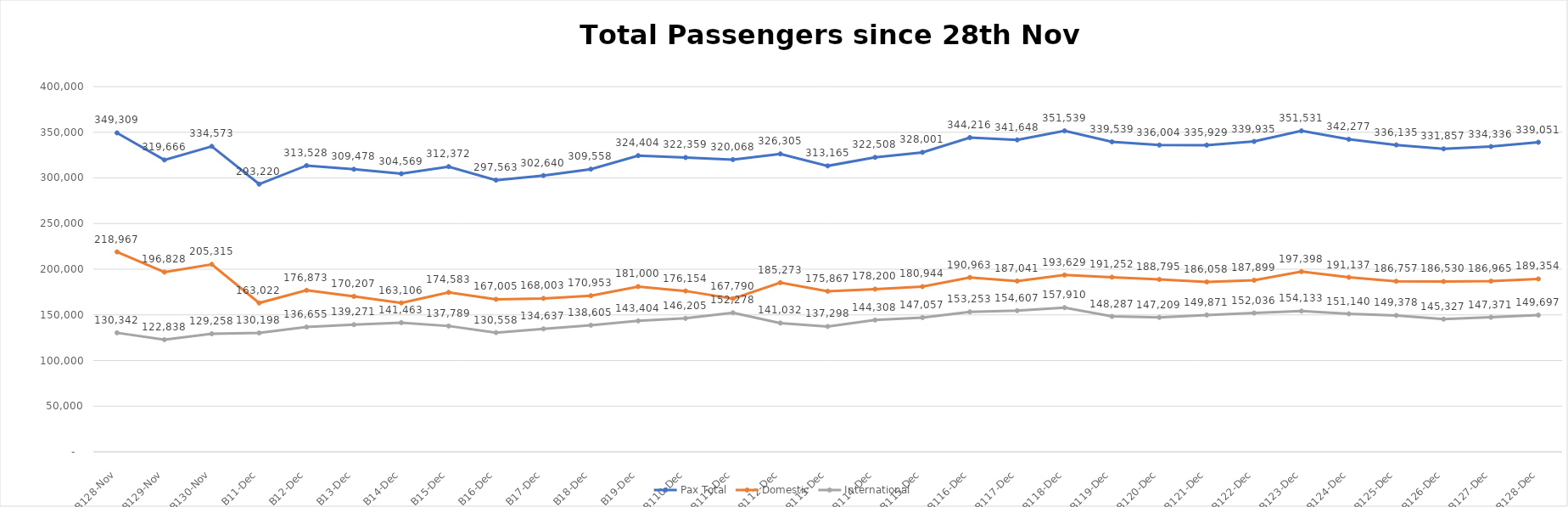
| Category | Pax Total |  Domestic  |  International  |
|---|---|---|---|
| 2022-11-28 | 349309 | 218967 | 130342 |
| 2022-11-29 | 319666 | 196828 | 122838 |
| 2022-11-30 | 334573 | 205315 | 129258 |
| 2022-12-01 | 293220 | 163022 | 130198 |
| 2022-12-02 | 313528 | 176873 | 136655 |
| 2022-12-03 | 309478 | 170207 | 139271 |
| 2022-12-04 | 304569 | 163106 | 141463 |
| 2022-12-05 | 312372 | 174583 | 137789 |
| 2022-12-06 | 297563 | 167005 | 130558 |
| 2022-12-07 | 302640 | 168003 | 134637 |
| 2022-12-08 | 309558 | 170953 | 138605 |
| 2022-12-09 | 324404 | 181000 | 143404 |
| 2022-12-10 | 322359 | 176154 | 146205 |
| 2022-12-11 | 320068 | 167790 | 152278 |
| 2022-12-12 | 326305 | 185273 | 141032 |
| 2022-12-13 | 313165 | 175867 | 137298 |
| 2022-12-14 | 322508 | 178200 | 144308 |
| 2022-12-15 | 328001 | 180944 | 147057 |
| 2022-12-16 | 344216 | 190963 | 153253 |
| 2022-12-17 | 341648 | 187041 | 154607 |
| 2022-12-18 | 351539 | 193629 | 157910 |
| 2022-12-19 | 339539 | 191252 | 148287 |
| 2022-12-20 | 336004 | 188795 | 147209 |
| 2022-12-21 | 335929 | 186058 | 149871 |
| 2022-12-22 | 339935 | 187899 | 152036 |
| 2022-12-23 | 351531 | 197398 | 154133 |
| 2022-12-24 | 342277 | 191137 | 151140 |
| 2022-12-25 | 336135 | 186757 | 149378 |
| 2022-12-26 | 331857 | 186530 | 145327 |
| 2022-12-27 | 334336 | 186965 | 147371 |
| 2022-12-28 | 339051 | 189354 | 149697 |